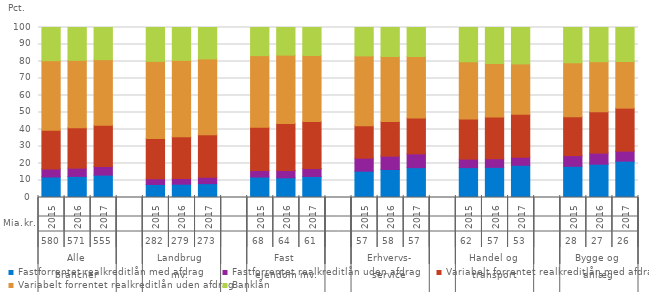
| Category | Fastforrentet realkreditlån med afdrag | Fastforrentet realkreditlån uden afdrag | Variabelt forrentet realkreditlån med afdrag | Variabelt forrentet realkreditlån uden afdrag | Banklån |
|---|---|---|---|---|---|
| 0 | 12.067 | 4.704 | 22.78 | 40.936 | 19.514 |
| 1 | 12.405 | 4.864 | 23.779 | 39.63 | 19.323 |
| 2 | 13.158 | 5.084 | 24.209 | 38.621 | 18.928 |
| 3 | 0 | 0 | 0 | 0 | 0 |
| 4 | 7.673 | 3.324 | 23.734 | 45.359 | 19.91 |
| 5 | 7.81 | 3.392 | 24.513 | 44.958 | 19.327 |
| 6 | 8.138 | 3.798 | 24.907 | 44.668 | 18.489 |
| 7 | 0 | 0 | 0 | 0 | 0 |
| 8 | 12.017 | 3.851 | 25.402 | 42.183 | 16.548 |
| 9 | 11.58 | 4.321 | 27.587 | 40.242 | 16.27 |
| 10 | 12.371 | 4.658 | 27.722 | 38.798 | 16.452 |
| 11 | 0 | 0 | 0 | 0 | 0 |
| 12 | 15.466 | 7.67 | 19.074 | 41.079 | 16.71 |
| 13 | 16.483 | 7.846 | 20.318 | 38.294 | 17.058 |
| 14 | 17.539 | 8.132 | 21.132 | 36.12 | 17.078 |
| 15 | 0 | 0 | 0 | 0 | 0 |
| 16 | 17.554 | 5.035 | 23.573 | 33.671 | 20.167 |
| 17 | 17.736 | 5.034 | 24.548 | 31.52 | 21.161 |
| 18 | 18.926 | 4.783 | 25.319 | 29.557 | 21.415 |
| 19 | 0 | 0 | 0 | 0 | 0 |
| 20 | 18.352 | 6.272 | 22.939 | 31.672 | 20.765 |
| 21 | 19.576 | 6.555 | 24.242 | 29.497 | 20.13 |
| 22 | 21.368 | 5.928 | 25.267 | 27.424 | 20.013 |